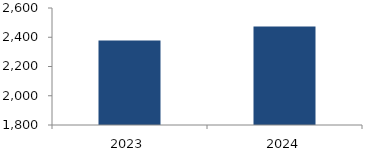
| Category | Series 0 |
|---|---|
| 2023.0 | 2377.765 |
| 2024.0 | 2474.168 |